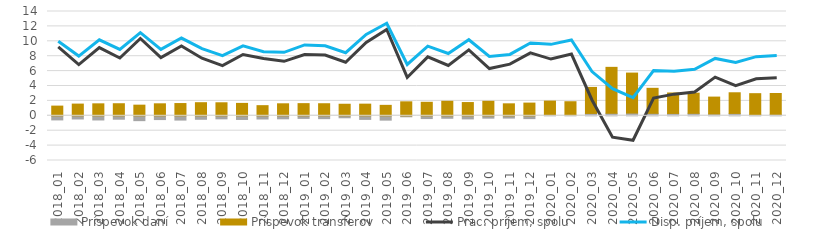
| Category | Príspevok daní | Príspevok transferov |
|---|---|---|
| 2018_01 | -0.552 | 1.301 |
| 2018_02 | -0.429 | 1.571 |
| 2018_03 | -0.559 | 1.607 |
| 2018_04 | -0.459 | 1.62 |
| 2018_05 | -0.652 | 1.428 |
| 2018_06 | -0.507 | 1.61 |
| 2018_07 | -0.574 | 1.644 |
| 2018_08 | -0.469 | 1.759 |
| 2018_09 | -0.408 | 1.747 |
| 2018_10 | -0.491 | 1.665 |
| 2018_11 | -0.43 | 1.361 |
| 2018_12 | -0.404 | 1.611 |
| 2019_01 | -0.349 | 1.633 |
| 2019_02 | -0.382 | 1.62 |
| 2019_03 | -0.266 | 1.551 |
| 2019_04 | -0.483 | 1.564 |
| 2019_05 | -0.582 | 1.402 |
| 2019_06 | -0.133 | 1.876 |
| 2019_07 | -0.371 | 1.814 |
| 2019_08 | -0.332 | 1.948 |
| 2019_09 | -0.417 | 1.779 |
| 2019_10 | -0.317 | 1.946 |
| 2019_11 | -0.307 | 1.608 |
| 2019_12 | -0.378 | 1.705 |
| 2020_01 | 0.117 | 1.857 |
| 2020_02 | 0.078 | 1.81 |
| 2020_03 | 0.319 | 3.492 |
| 2020_04 | 0.338 | 6.165 |
| 2020_05 | 0.367 | 5.367 |
| 2020_06 | 0.332 | 3.356 |
| 2020_07 | 0.318 | 2.745 |
| 2020_08 | 0.331 | 2.707 |
| 2020_09 | 0.242 | 2.269 |
| 2020_10 | 0.32 | 2.771 |
| 2020_11 | 0.14 | 2.83 |
| 2020_12 | 0.193 | 2.802 |